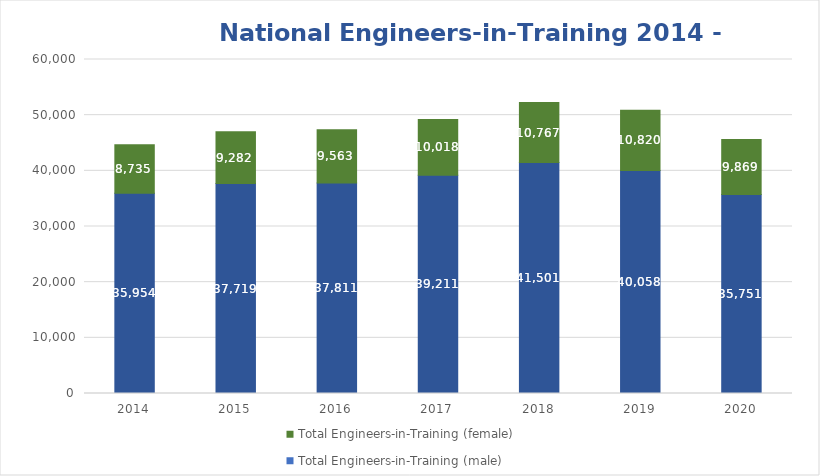
| Category | Total Engineers-in-Training (male) | Total Engineers-in-Training (female) |
|---|---|---|
| 2014.0 | 35954 | 8735 |
| 2015.0 | 37719 | 9282 |
| 2016.0 | 37811 | 9563 |
| 2017.0 | 39211 | 10018 |
| 2018.0 | 41501 | 10767 |
| 2019.0 | 40058 | 10820 |
| 2020.0 | 35751 | 9869 |